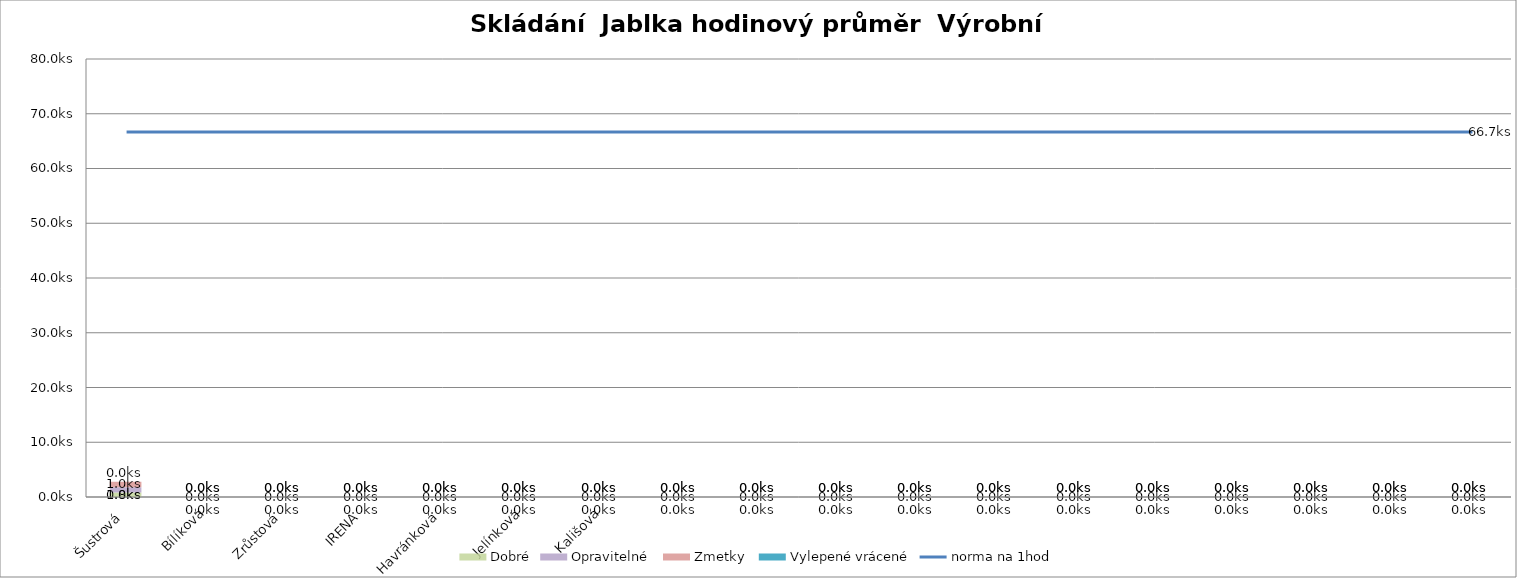
| Category | Dobré | Opravitelné  | Zmetky  | Vylepené vrácené |
|---|---|---|---|---|
| Šustrová | 0.8 | 1 | 1 | 0 |
| Bílíková | 0 | 0 | 0 | 0 |
| Zrůstová | 0 | 0 | 0 | 0 |
| IRENA | 0 | 0 | 0 | 0 |
| Havránková | 0 | 0 | 0 | 0 |
| Jelínková | 0 | 0 | 0 | 0 |
| Kališová | 0 | 0 | 0 | 0 |